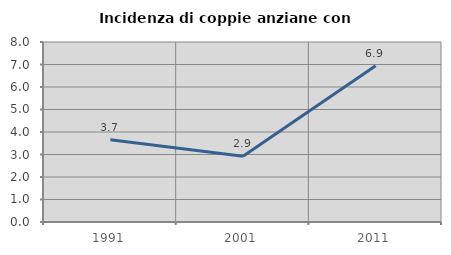
| Category | Incidenza di coppie anziane con figli |
|---|---|
| 1991.0 | 3.659 |
| 2001.0 | 2.921 |
| 2011.0 | 6.944 |